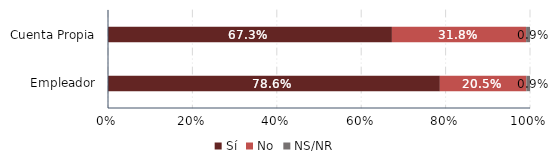
| Category | Sí | No | NS/NR |
|---|---|---|---|
| Empleador | 0.786 | 0.205 | 0.009 |
| Cuenta Propia | 0.673 | 0.318 | 0.009 |